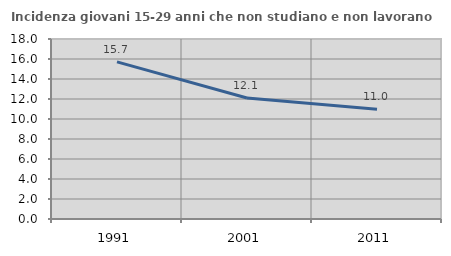
| Category | Incidenza giovani 15-29 anni che non studiano e non lavorano  |
|---|---|
| 1991.0 | 15.714 |
| 2001.0 | 12.1 |
| 2011.0 | 10.976 |